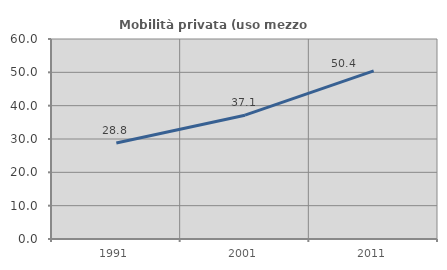
| Category | Mobilità privata (uso mezzo privato) |
|---|---|
| 1991.0 | 28.779 |
| 2001.0 | 37.139 |
| 2011.0 | 50.417 |